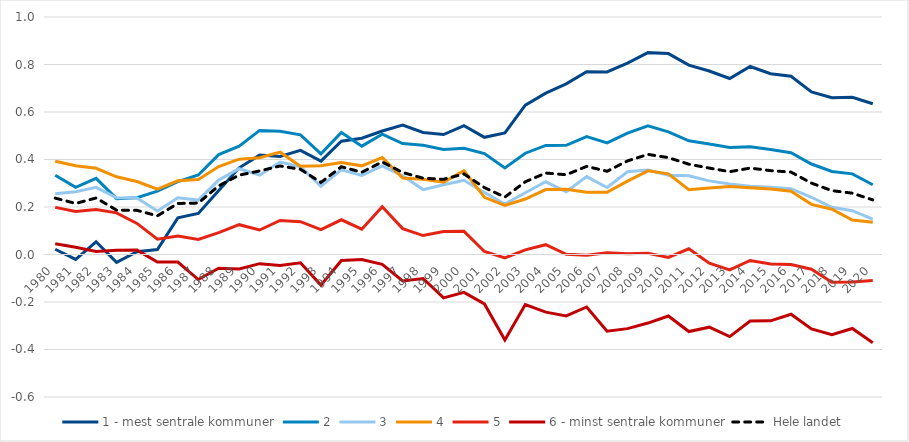
| Category | 1 - mest sentrale kommuner | 2 | 3 | 4 | 5 | 6 - minst sentrale kommuner | Hele landet |
|---|---|---|---|---|---|---|---|
| 1980.0 | 0.022 | 0.334 | 0.255 | 0.393 | 0.198 | 0.046 | 0.237 |
| 1981.0 | -0.021 | 0.283 | 0.264 | 0.373 | 0.182 | 0.031 | 0.215 |
| 1982.0 | 0.053 | 0.321 | 0.283 | 0.363 | 0.189 | 0.013 | 0.238 |
| 1983.0 | -0.033 | 0.235 | 0.238 | 0.327 | 0.175 | 0.018 | 0.187 |
| 1984.0 | 0.012 | 0.239 | 0.238 | 0.307 | 0.131 | 0.019 | 0.186 |
| 1985.0 | 0.021 | 0.267 | 0.183 | 0.275 | 0.064 | -0.031 | 0.163 |
| 1986.0 | 0.154 | 0.307 | 0.239 | 0.31 | 0.078 | -0.032 | 0.215 |
| 1987.0 | 0.173 | 0.335 | 0.229 | 0.315 | 0.063 | -0.105 | 0.217 |
| 1988.0 | 0.269 | 0.421 | 0.313 | 0.37 | 0.092 | -0.058 | 0.289 |
| 1989.0 | 0.365 | 0.456 | 0.361 | 0.402 | 0.126 | -0.061 | 0.334 |
| 1990.0 | 0.418 | 0.522 | 0.334 | 0.408 | 0.103 | -0.039 | 0.352 |
| 1991.0 | 0.413 | 0.519 | 0.389 | 0.431 | 0.143 | -0.046 | 0.373 |
| 1992.0 | 0.438 | 0.504 | 0.37 | 0.372 | 0.138 | -0.035 | 0.359 |
| 1993.0 | 0.393 | 0.424 | 0.287 | 0.374 | 0.105 | -0.129 | 0.303 |
| 1994.0 | 0.477 | 0.513 | 0.356 | 0.387 | 0.146 | -0.025 | 0.369 |
| 1995.0 | 0.49 | 0.456 | 0.333 | 0.373 | 0.106 | -0.021 | 0.346 |
| 1996.0 | 0.52 | 0.506 | 0.373 | 0.408 | 0.201 | -0.041 | 0.39 |
| 1997.0 | 0.545 | 0.467 | 0.331 | 0.322 | 0.109 | -0.112 | 0.345 |
| 1998.0 | 0.514 | 0.46 | 0.273 | 0.317 | 0.08 | -0.101 | 0.321 |
| 1999.0 | 0.505 | 0.442 | 0.294 | 0.305 | 0.097 | -0.183 | 0.317 |
| 2000.0 | 0.543 | 0.447 | 0.313 | 0.353 | 0.097 | -0.159 | 0.339 |
| 2001.0 | 0.493 | 0.425 | 0.261 | 0.241 | 0.013 | -0.208 | 0.282 |
| 2002.0 | 0.512 | 0.364 | 0.212 | 0.207 | -0.014 | -0.36 | 0.242 |
| 2003.0 | 0.629 | 0.426 | 0.26 | 0.234 | 0.02 | -0.211 | 0.306 |
| 2004.0 | 0.679 | 0.459 | 0.306 | 0.273 | 0.041 | -0.243 | 0.343 |
| 2005.0 | 0.719 | 0.46 | 0.264 | 0.274 | 0.001 | -0.259 | 0.336 |
| 2006.0 | 0.77 | 0.497 | 0.328 | 0.262 | -0.003 | -0.221 | 0.371 |
| 2007.0 | 0.769 | 0.47 | 0.282 | 0.262 | 0.007 | -0.323 | 0.35 |
| 2008.0 | 0.806 | 0.511 | 0.348 | 0.309 | 0.003 | -0.312 | 0.394 |
| 2009.0 | 0.85 | 0.542 | 0.355 | 0.352 | 0.005 | -0.289 | 0.422 |
| 2010.0 | 0.846 | 0.516 | 0.333 | 0.34 | -0.012 | -0.259 | 0.408 |
| 2011.0 | 0.798 | 0.479 | 0.332 | 0.273 | 0.024 | -0.324 | 0.38 |
| 2012.0 | 0.772 | 0.465 | 0.31 | 0.28 | -0.036 | -0.306 | 0.364 |
| 2013.0 | 0.741 | 0.45 | 0.297 | 0.287 | -0.065 | -0.346 | 0.349 |
| 2014.0 | 0.792 | 0.454 | 0.287 | 0.281 | -0.025 | -0.28 | 0.364 |
| 2015.0 | 0.761 | 0.442 | 0.283 | 0.275 | -0.04 | -0.279 | 0.353 |
| 2016.0 | 0.75 | 0.429 | 0.277 | 0.266 | -0.042 | -0.252 | 0.347 |
| 2017.0 | 0.685 | 0.381 | 0.241 | 0.211 | -0.062 | -0.313 | 0.301 |
| 2018.0 | 0.66 | 0.35 | 0.199 | 0.191 | -0.116 | -0.338 | 0.269 |
| 2019.0 | 0.662 | 0.339 | 0.185 | 0.145 | -0.116 | -0.312 | 0.258 |
| 2020.0 | 0.635 | 0.294 | 0.149 | 0.135 | -0.109 | -0.372 | 0.23 |